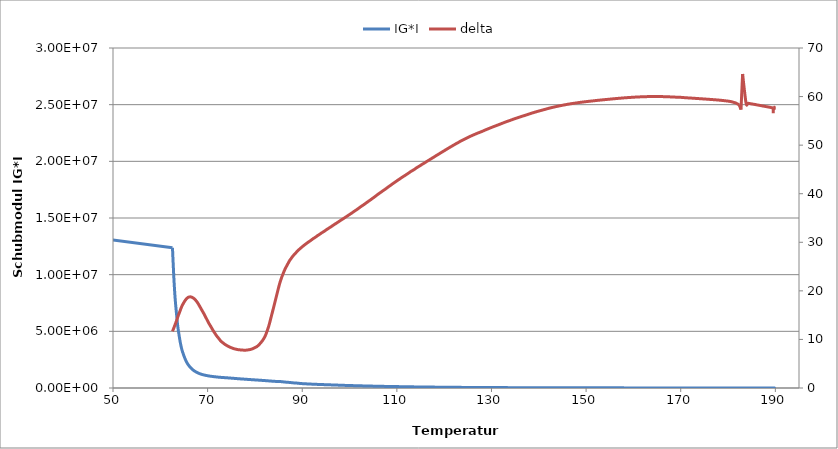
| Category | IG*I |
|---|---|
| 189.559998 | 3645.657 |
| 189.580017 | 3603.149 |
| 189.600006 | 3567.276 |
| 189.610016 | 3543.111 |
| 189.640015 | 3517.145 |
| 189.640015 | 3491.642 |
| 189.660004 | 3466.957 |
| 189.670013 | 3442.706 |
| 189.700012 | 3418.719 |
| 189.710022 | 3395.492 |
| 189.720001 | 3372.838 |
| 189.730011 | 3350.115 |
| 189.75 | 3328.009 |
| 189.76001 | 3306.282 |
| 189.790009 | 3150.886 |
| 189.800018 | 3208.682 |
| 189.779999 | 3257.522 |
| 189.779999 | 3296.92 |
| 189.740021 | 3329.167 |
| 189.700012 | 3356.545 |
| 189.640015 | 3381.875 |
| 189.559998 | 3406.962 |
| 189.480011 | 3432.808 |
| 189.410004 | 3460.062 |
| 189.300018 | 3488.46 |
| 189.040009 | 3520.866 |
| 188.940002 | 3553.595 |
| 188.77002 | 3585.697 |
| 188.610016 | 3619.915 |
| 188.429993 | 3656.557 |
| 188.040009 | 3693.501 |
| 187.839996 | 3734.601 |
| 187.610016 | 3775.608 |
| 187.369995 | 3819.544 |
| 187.119995 | 3865.004 |
| 186.619995 | 3913.327 |
| 186.360016 | 3962.328 |
| 186.050018 | 4014.606 |
| 185.800018 | 4068.486 |
| 185.160004 | 4125.154 |
| 184.839996 | 4183.204 |
| 184.550018 | 4244.794 |
| 184.160004 | 4308.196 |
| 183.800018 | 4373.795 |
| 183.080017 | 4442.048 |
| 182.740021 | 4512.678 |
| 182.360016 | 4586.892 |
| 181.920013 | 4662.885 |
| 181.559998 | 4742.138 |
| 180.730011 | 4826.029 |
| 180.330017 | 4910.515 |
| 179.880005 | 4999.129 |
| 179.410004 | 5090.126 |
| 178.580017 | 5184.027 |
| 178.140015 | 5281.545 |
| 177.679993 | 5382.63 |
| 177.220001 | 5486.467 |
| 176.800018 | 5591.97 |
| 175.860016 | 5701.405 |
| 175.369995 | 5817.809 |
| 174.910004 | 5933.178 |
| 174.429993 | 6053.163 |
| 173.940002 | 6177.155 |
| 172.960022 | 6305.113 |
| 172.480011 | 6435.959 |
| 171.980011 | 6572.025 |
| 171.5 | 6712.839 |
| 170.970001 | 6855.702 |
| 169.970001 | 7005.099 |
| 169.450012 | 7157.561 |
| 168.940002 | 7317.163 |
| 168.470001 | 7479.83 |
| 167.410004 | 7648.176 |
| 166.920013 | 7823.827 |
| 166.380005 | 8001.714 |
| 165.929993 | 8186.86 |
| 165.399994 | 8376.365 |
| 164.339996 | 8573.725 |
| 163.830017 | 8773.783 |
| 163.309998 | 8986.739 |
| 162.790009 | 9201.281 |
| 162.200012 | 9427.719 |
| 161.240021 | 9659.029 |
| 160.619995 | 9897.948 |
| 160.170013 | 10145.296 |
| 159.580017 | 10396.873 |
| 159.100006 | 10664.059 |
| 157.990021 | 10938.084 |
| 157.529999 | 11220.254 |
| 156.980011 | 11510.513 |
| 156.470001 | 11810.786 |
| 155.429993 | 12117.731 |
| 154.899994 | 12446.771 |
| 154.369995 | 12776.296 |
| 153.860016 | 13116.984 |
| 153.350006 | 13470.154 |
| 152.26001 | 13833.445 |
| 151.790009 | 14211.108 |
| 151.27002 | 14599.008 |
| 150.710022 | 14997.43 |
| 150.210022 | 15410.444 |
| 149.130005 | 15832.504 |
| 148.610016 | 16271.161 |
| 148.140015 | 16724.043 |
| 147.630005 | 17184.984 |
| 147.089996 | 17668.938 |
| 146.050018 | 18161.654 |
| 145.550018 | 18672.476 |
| 145.050018 | 19202.113 |
| 144.540009 | 19744.257 |
| 143.5 | 20302.777 |
| 142.970001 | 20880.968 |
| 142.450012 | 21490.001 |
| 141.950012 | 22103.489 |
| 141.480011 | 22746.364 |
| 140.450012 | 23409.482 |
| 139.910004 | 24070.627 |
| 139.399994 | 24793.621 |
| 138.880005 | 25506.398 |
| 138.360016 | 26275.557 |
| 137.390015 | 27057.11 |
| 136.890015 | 27867.163 |
| 136.320007 | 28700.011 |
| 135.850006 | 29559.147 |
| 134.800018 | 30450.043 |
| 134.320007 | 31376.922 |
| 133.820007 | 32335.413 |
| 133.309998 | 33313.947 |
| 132.830017 | 34328.709 |
| 131.899994 | 35380.833 |
| 131.420013 | 36467.515 |
| 130.929993 | 37586.521 |
| 130.429993 | 38756.352 |
| 129.950012 | 39944.308 |
| 128.980011 | 41169.687 |
| 128.5 | 42445.873 |
| 128.040009 | 43733.816 |
| 127.55999 | 45082.621 |
| 127.07 | 46465.711 |
| 126.149986 | 47892.056 |
| 125.700005 | 49379.278 |
| 125.239983 | 50887.975 |
| 124.830009 | 52444.225 |
| 123.950005 | 54051.494 |
| 123.480003 | 55692.788 |
| 123.089989 | 57372.682 |
| 122.640007 | 59134.86 |
| 122.219994 | 60911.112 |
| 121.360008 | 62762.927 |
| 120.929985 | 64680.296 |
| 120.489983 | 66643.924 |
| 120.080009 | 68665.508 |
| 119.649986 | 70738.257 |
| 118.790001 | 72850.919 |
| 118.360008 | 75097.356 |
| 117.959984 | 77325.628 |
| 117.519981 | 79675.139 |
| 117.110008 | 82094 |
| 116.260002 | 84554.852 |
| 115.869987 | 87075.782 |
| 115.399986 | 89693.683 |
| 115.010002 | 92414.235 |
| 114.149986 | 95142.846 |
| 113.790001 | 98008.765 |
| 113.379997 | 100932.608 |
| 112.920006 | 103917.086 |
| 112.55999 | 106977.69 |
| 111.760002 | 110139.965 |
| 111.330009 | 113380.469 |
| 110.929985 | 116680.523 |
| 110.550011 | 120042.09 |
| 110.140007 | 123520.351 |
| 109.360008 | 127038.844 |
| 108.980003 | 130699.544 |
| 108.599998 | 134387.045 |
| 108.209984 | 138226.7 |
| 107.469994 | 142068.613 |
| 107.05999 | 145979.422 |
| 106.670006 | 149993.274 |
| 106.279991 | 154088.754 |
| 105.899986 | 158232.462 |
| 105.189995 | 162408.65 |
| 104.800011 | 166709.162 |
| 104.439995 | 171068.378 |
| 104.050011 | 175547.44 |
| 103.689995 | 180039.725 |
| 102.980003 | 184682.215 |
| 102.580009 | 189365.893 |
| 102.230003 | 194157.546 |
| 101.890007 | 199029.403 |
| 101.540001 | 203928.539 |
| 100.82 | 208966.313 |
| 100.489983 | 214130.975 |
| 100.129997 | 219302.972 |
| 99.769981 | 224542.823 |
| 99.089989 | 229947.278 |
| 98.739983 | 235394.025 |
| 98.379997 | 240853.209 |
| 98.029991 | 246539.21 |
| 97.700005 | 252304.789 |
| 97.029991 | 258013.26 |
| 96.689995 | 263932.185 |
| 96.369987 | 269788.923 |
| 96.05999 | 275707.406 |
| 95.709984 | 281731.52 |
| 95.05999 | 287891.734 |
| 94.760002 | 293991.797 |
| 94.439995 | 300307.883 |
| 94.099998 | 306563.008 |
| 93.800011 | 312936.3 |
| 93.159996 | 319277.04 |
| 92.890007 | 325685.044 |
| 92.55999 | 332150.108 |
| 92.239983 | 338712.511 |
| 91.670006 | 345167.297 |
| 91.349998 | 351794.095 |
| 91.040001 | 358389.052 |
| 90.749992 | 375881.893 |
| 90.439995 | 380341.429 |
| 89.860008 | 388735.508 |
| 89.55999 | 400076.943 |
| 89.269981 | 412844.452 |
| 88.969994 | 426254.313 |
| 88.709984 | 439427.055 |
| 88.119987 | 452959.768 |
| 87.839989 | 466229.997 |
| 87.55999 | 479626.267 |
| 87.269981 | 492274.334 |
| 86.760002 | 505538.185 |
| 86.459984 | 518893.537 |
| 86.189995 | 532249.968 |
| 85.929985 | 545235.34 |
| 85.659996 | 558574.06 |
| 85.170006 | 571780.263 |
| 84.249992 | 585049.216 |
| 83.769981 | 598403.292 |
| 83.349998 | 611886.256 |
| 82.969994 | 625094.224 |
| 82.55999 | 638023.125 |
| 82.179985 | 651406.443 |
| 81.749992 | 664359.777 |
| 81.300011 | 677531.439 |
| 80.849998 | 690805.937 |
| 80.439995 | 703518.57 |
| 79.950005 | 716363.28 |
| 79.499992 | 729378.531 |
| 79.07 | 741965.662 |
| 78.610008 | 754861.789 |
| 78.170006 | 767772.537 |
| 77.749992 | 780853.385 |
| 77.30999 | 793985.552 |
| 76.849998 | 807274.669 |
| 76.450005 | 820574.188 |
| 76.019981 | 833943.376 |
| 75.619987 | 847972.602 |
| 75.189995 | 862335.354 |
| 74.779991 | 876744.324 |
| 74.390007 | 890452.779 |
| 73.950005 | 902672.678 |
| 73.540001 | 915082.252 |
| 73.149986 | 926639.513 |
| 72.749992 | 939376.922 |
| 72.399986 | 952573.263 |
| 72.050011 | 966784.413 |
| 71.709984 | 982552.315 |
| 71.360008 | 999302.841 |
| 70.989983 | 1018949.919 |
| 70.619987 | 1040114.403 |
| 70.249992 | 1063848.092 |
| 69.890007 | 1090473.134 |
| 69.529991 | 1120412.249 |
| 69.179985 | 1155192.753 |
| 68.80999 | 1195176.139 |
| 68.459984 | 1241146.034 |
| 68.129997 | 1296022.832 |
| 67.80999 | 1359565.246 |
| 67.480003 | 1434791.306 |
| 67.129997 | 1523686.178 |
| 66.80999 | 1628521.75 |
| 66.499992 | 1754510.325 |
| 66.170006 | 1905968.225 |
| 65.839989 | 2089411.539 |
| 65.529991 | 2310978.966 |
| 65.230003 | 2582063.212 |
| 64.920006 | 2921075.079 |
| 64.589989 | 3335487.372 |
| 64.300011 | 3854356.673 |
| 64.019981 | 4517990.57 |
| 63.709984 | 5375776.555 |
| 63.439995 | 6472881.958 |
| 63.129997 | 7915196.605 |
| 62.849998 | 9834862.295 |
| 62.57 | 12378303.115 |